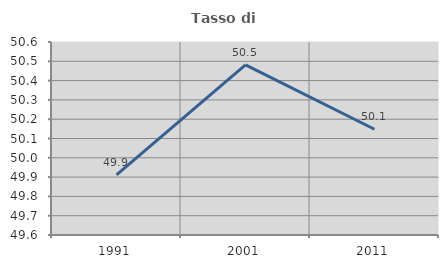
| Category | Tasso di occupazione   |
|---|---|
| 1991.0 | 49.912 |
| 2001.0 | 50.482 |
| 2011.0 | 50.148 |